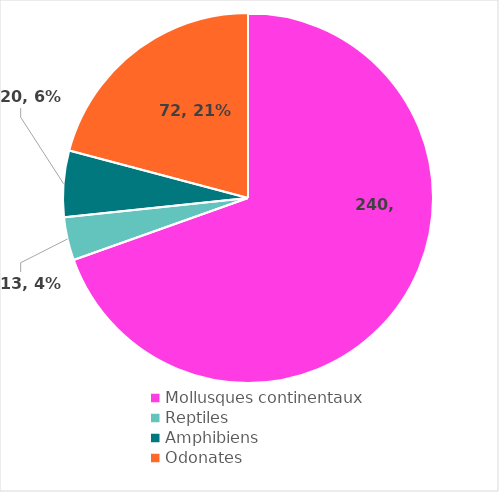
| Category | 240 |
|---|---|
| Mollusques continentaux  | 240 |
| Reptiles | 13 |
| Amphibiens | 20 |
| Odonates | 72 |